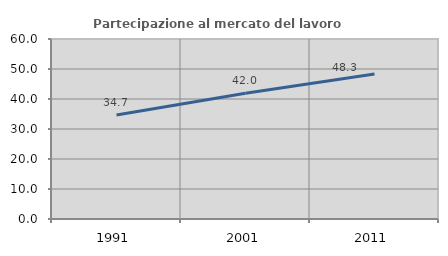
| Category | Partecipazione al mercato del lavoro  femminile |
|---|---|
| 1991.0 | 34.651 |
| 2001.0 | 41.95 |
| 2011.0 | 48.315 |